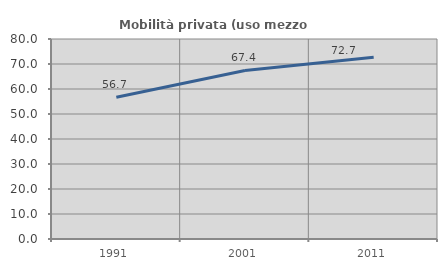
| Category | Mobilità privata (uso mezzo privato) |
|---|---|
| 1991.0 | 56.701 |
| 2001.0 | 67.435 |
| 2011.0 | 72.655 |